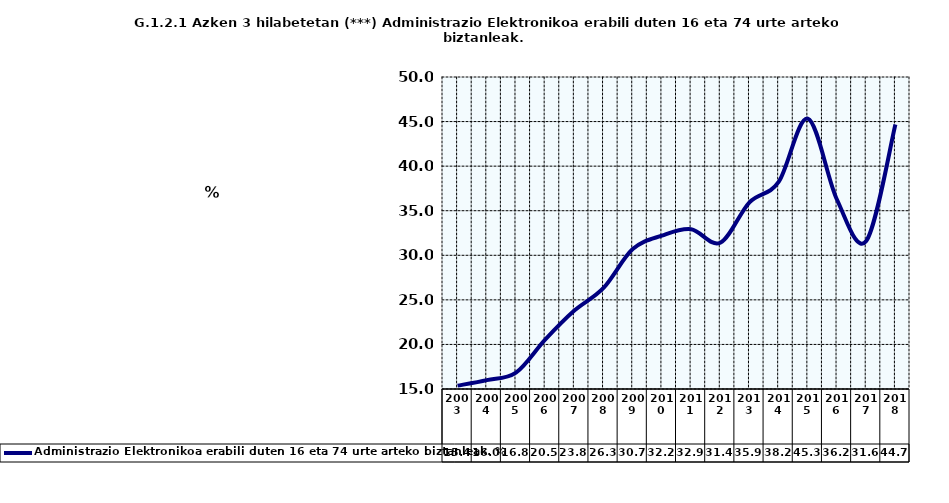
| Category | Administrazio Elektronikoa erabili duten 16 eta 74 urte arteko biztanleak. % |
|---|---|
| 2003.0 | 15.375 |
| 2004.0 | 15.991 |
| 2005.0 | 16.831 |
| 2006.0 | 20.537 |
| 2007.0 | 23.794 |
| 2008.0 | 26.338 |
| 2009.0 | 30.694 |
| 2010.0 | 32.207 |
| 2011.0 | 32.922 |
| 2012.0 | 31.411 |
| 2013.0 | 35.945 |
| 2014.0 | 38.224 |
| 2015.0 | 45.329 |
| 2016.0 | 36.231 |
| 2017.0 | 31.608 |
| 2018.0 | 44.663 |